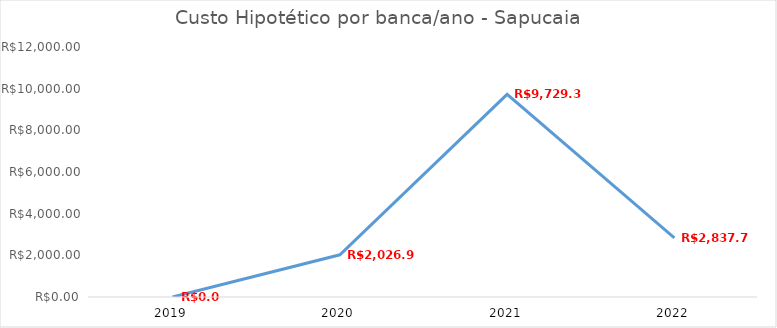
| Category | Series 0 |
|---|---|
| 2019.0 | 0 |
| 2020.0 | 2026.95 |
| 2021.0 | 9729.36 |
| 2022.0 | 2837.73 |